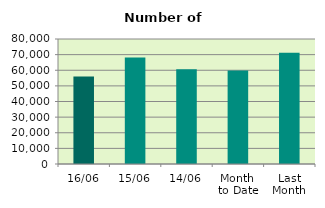
| Category | Series 0 |
|---|---|
| 16/06 | 56070 |
| 15/06 | 68134 |
| 14/06 | 60652 |
| Month 
to Date | 59867.333 |
| Last
Month | 71249.7 |